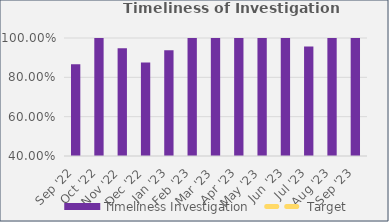
| Category | Timeliness Investigation |
|---|---|
| Sep '22 | 0.867 |
| Oct '22 | 1 |
| Nov '22 | 0.947 |
| Dec '22 | 0.875 |
| Jan '23 | 0.938 |
| Feb '23 | 1 |
| Mar '23 | 1 |
| Apr '23 | 1 |
| May '23 | 1 |
| Jun '23 | 1 |
| Jul '23 | 0.957 |
| Aug '23 | 1 |
| Sep '23 | 1 |